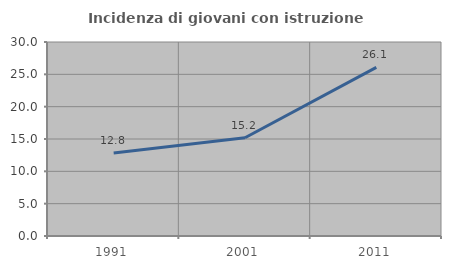
| Category | Incidenza di giovani con istruzione universitaria |
|---|---|
| 1991.0 | 12.826 |
| 2001.0 | 15.197 |
| 2011.0 | 26.087 |